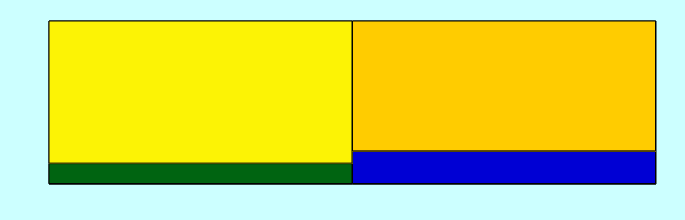
| Category | Series 0 | Series 1 |
|---|---|---|
| 0 | 0.125 | 0.875 |
| 1 | 0.2 | 0.8 |